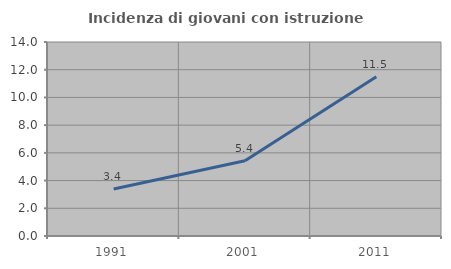
| Category | Incidenza di giovani con istruzione universitaria |
|---|---|
| 1991.0 | 3.395 |
| 2001.0 | 5.435 |
| 2011.0 | 11.492 |